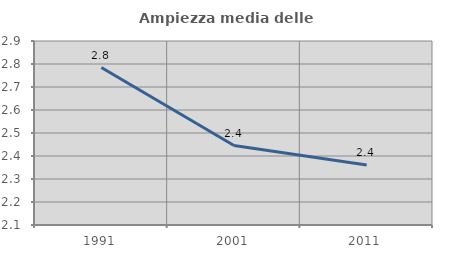
| Category | Ampiezza media delle famiglie |
|---|---|
| 1991.0 | 2.785 |
| 2001.0 | 2.445 |
| 2011.0 | 2.361 |